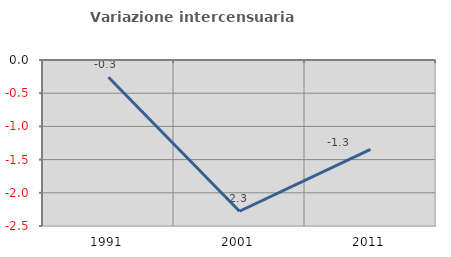
| Category | Variazione intercensuaria annua |
|---|---|
| 1991.0 | -0.261 |
| 2001.0 | -2.278 |
| 2011.0 | -1.346 |